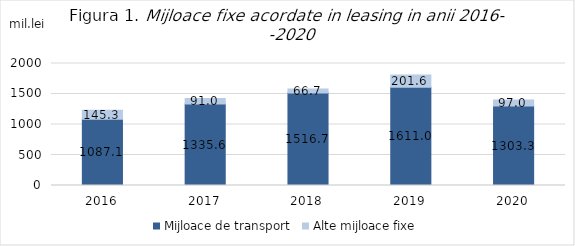
| Category | Mijloace de transport | Alte mijloace fixe |
|---|---|---|
| 2016.0 | 1087.1 | 145.3 |
| 2017.0 | 1335.6 | 91 |
| 2018.0 | 1516.7 | 66.7 |
| 2019.0 | 1611 | 201.6 |
| 2020.0 | 1303.3 | 97 |